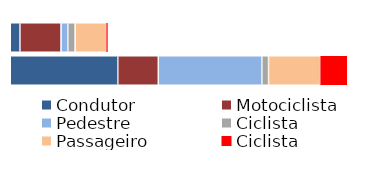
| Category | Condutor | Motociclista | Pedestre | Ciclista | Passageiro |
|---|---|---|---|---|---|
| Feminino | 46 | 196 | 32 | 6 | 150 |
| Masculino | 512 | 193 | 493 | 127 | 248 |